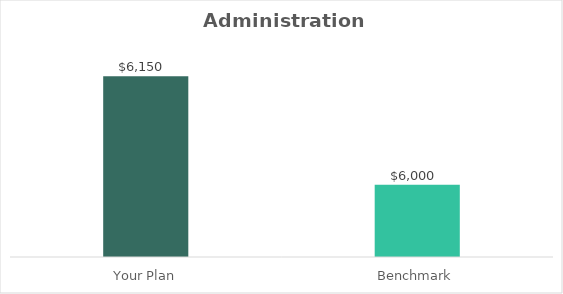
| Category | Series 0 |
|---|---|
| Your Plan | 6150 |
| Benchmark | 6000 |